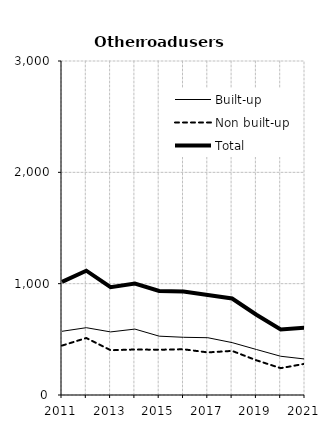
| Category | Built-up | Non built-up | Total |
|---|---|---|---|
| 2011.0 | 572.3 | 443.7 | 1015.9 |
| 2012.0 | 604.5 | 511.9 | 1116.4 |
| 2013.0 | 566.7 | 402.1 | 968.9 |
| 2014.0 | 592.1 | 408.6 | 1000.7 |
| 2015.0 | 528.4 | 406.6 | 934.9 |
| 2016.0 | 518.4 | 410.6 | 929.1 |
| 2017.0 | 514.6 | 382.6 | 897.4 |
| 2018.0 | 470.6 | 396.1 | 866.6 |
| 2019.0 | 408.7 | 311.8 | 720.6 |
| 2020.0 | 348 | 241 | 589 |
| 2021.0 | 323 | 281 | 604 |